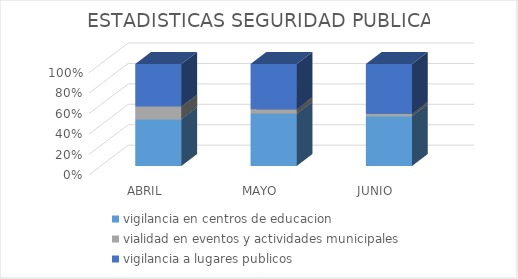
| Category | vigilancia en centros de educacion | vialidad en eventos y actividades municipales | vigilancia a lugares publicos |
|---|---|---|---|
| ABRIL | 22 | 6 | 20 |
| MAYO | 23 | 2 | 20 |
| JUNIO | 20 | 1 | 20 |